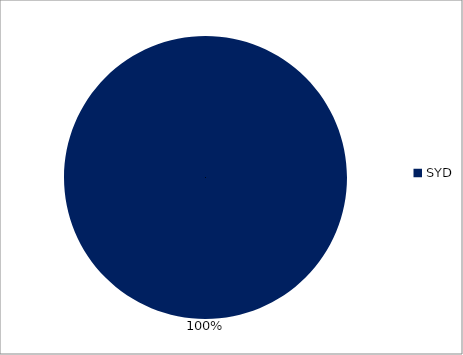
| Category | Series 0 |
|---|---|
| SYD | 1 |